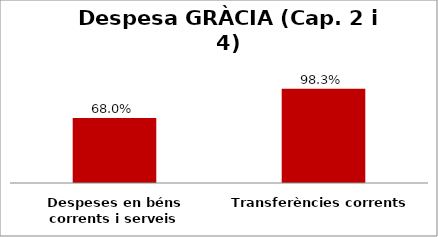
| Category | Series 0 |
|---|---|
| Despeses en béns corrents i serveis | 0.68 |
| Transferències corrents | 0.983 |